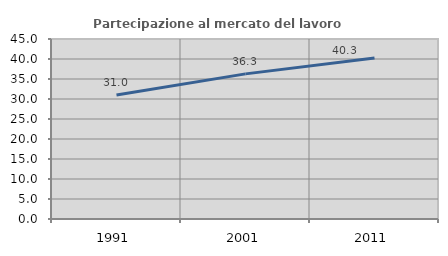
| Category | Partecipazione al mercato del lavoro  femminile |
|---|---|
| 1991.0 | 31.005 |
| 2001.0 | 36.28 |
| 2011.0 | 40.26 |